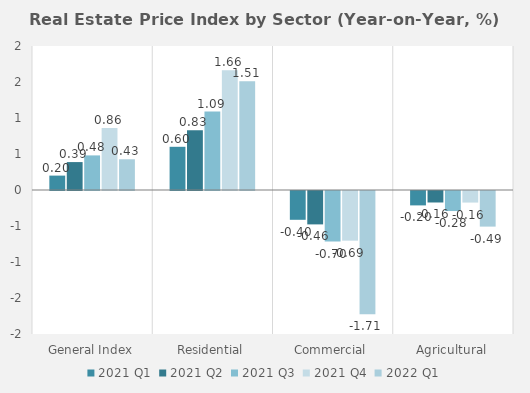
| Category | 2021 | 2022 |
|---|---|---|
| General Index | 0.862 | 0.427 |
| Residential | 1.664 | 1.509 |
| Commercial | -0.69 | -1.712 |
| Agricultural | -0.161 | -0.495 |